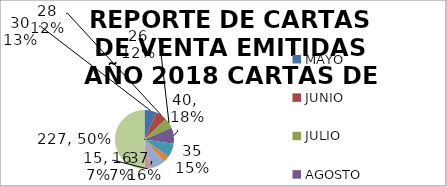
| Category | REPORTE DE CARTAS DE VENTA EMITIDAS AÑO 2018 CARTAS DE VENTAS EMITIDAS |
|---|---|
| MAYO | 30 |
| JUNIO | 28 |
| JULIO | 26 |
| AGOSTO | 40 |
| SEPTIEMBRE | 35 |
| OCTUBRE | 16 |
| NOVIEMBRE | 37 |
| DICIEMBRE | 15 |
| TOTAL DE CARTAS DE VENTAS EMITIDAS   | 227 |